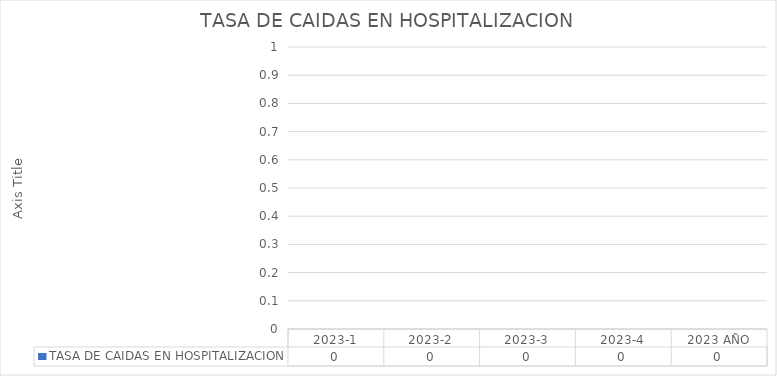
| Category | TASA DE CAIDAS EN HOSPITALIZACION  |
|---|---|
| 2023-1 | 0 |
| 2023-2 | 0 |
| 2023-3 | 0 |
| 2023-4 | 0 |
| 2023 AÑO | 0 |